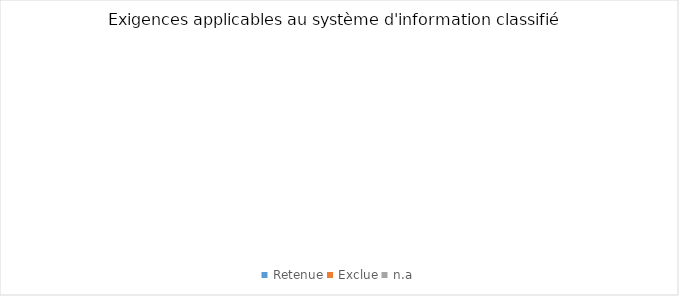
| Category | Series 0 |
|---|---|
| Retenue | 0 |
| Exclue | 0 |
| n.a | 0 |